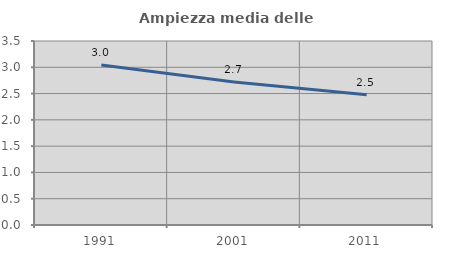
| Category | Ampiezza media delle famiglie |
|---|---|
| 1991.0 | 3.042 |
| 2001.0 | 2.719 |
| 2011.0 | 2.477 |